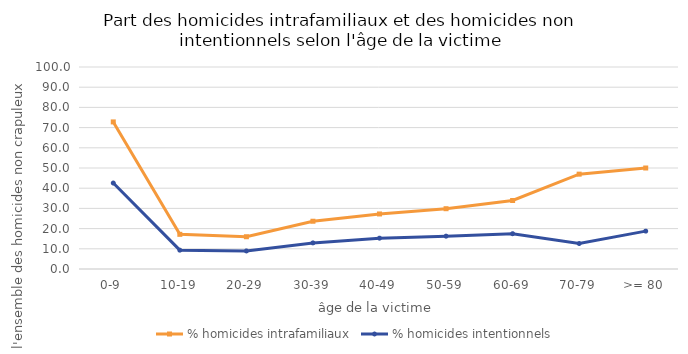
| Category | % homicides intrafamiliaux | % homicides intentionnels |
|---|---|---|
| 0-9 | 72.813 | 42.553 |
| 10-19 | 17.164 | 9.328 |
| 20-29 | 15.975 | 8.931 |
| 30-39 | 23.643 | 12.92 |
| 40-49 | 27.247 | 15.264 |
| 50-59 | 29.851 | 16.252 |
| 60-69 | 33.924 | 17.468 |
| 70-79 | 46.957 | 12.609 |
| >= 80 | 50 | 18.75 |